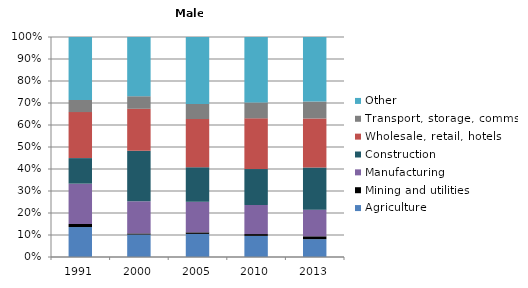
| Category | Agriculture | Mining and utilities | Manufacturing | Construction | Wholesale, retail, hotels | Transport, storage, comms | Other |
|---|---|---|---|---|---|---|---|
| 1991.0 | 13.6 | 1.4 | 18.3 | 11.6 | 20.9 | 5.5 | 28.6 |
| 2000.0 | 10.2 | 0.5 | 14.6 | 23 | 19 | 5.7 | 26.9 |
| 2005.0 | 10.5 | 0.7 | 13.9 | 15.7 | 21.9 | 6.9 | 30.4 |
| 2010.0 | 9.6 | 0.8 | 13.2 | 16.3 | 23 | 7.2 | 29.7 |
| 2013.0 | 8.1 | 1.3 | 12.1 | 19.1 | 22.3 | 7.7 | 29.3 |